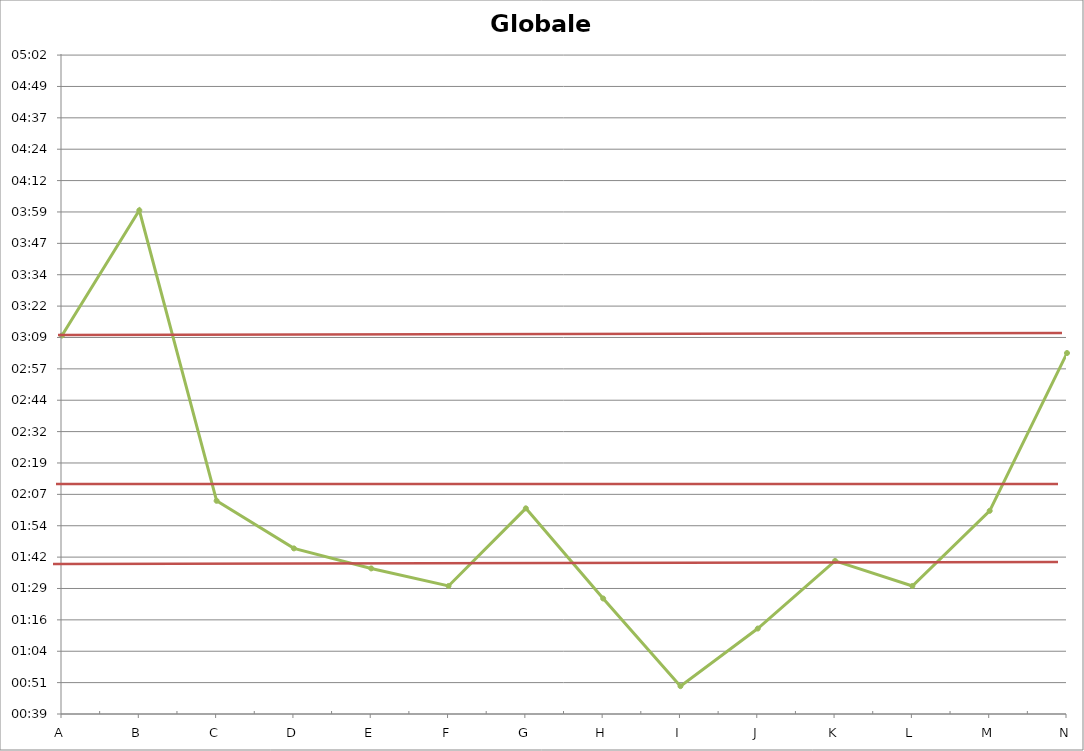
| Category | Globale Rumpfkraft |
|---|---|
| A | 0.002 |
| B | 0.003 |
| C | 0.001 |
| D | 0.001 |
| E | 0.001 |
| F | 0.001 |
| G | 0.001 |
| H | 0.001 |
| I | 0.001 |
| J | 0.001 |
| K | 0.001 |
| L | 0.001 |
| M | 0.001 |
| N | 0.002 |